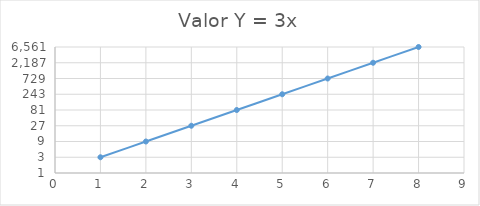
| Category | Valor Y = 3x |
|---|---|
| 1.0 | 3 |
| 2.0 | 9 |
| 3.0 | 27 |
| 4.0 | 81 |
| 5.0 | 243 |
| 6.0 | 729 |
| 7.0 | 2187 |
| 8.0 | 6561 |